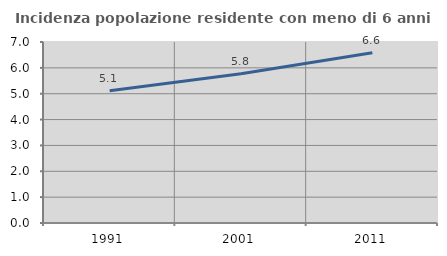
| Category | Incidenza popolazione residente con meno di 6 anni |
|---|---|
| 1991.0 | 5.118 |
| 2001.0 | 5.77 |
| 2011.0 | 6.587 |